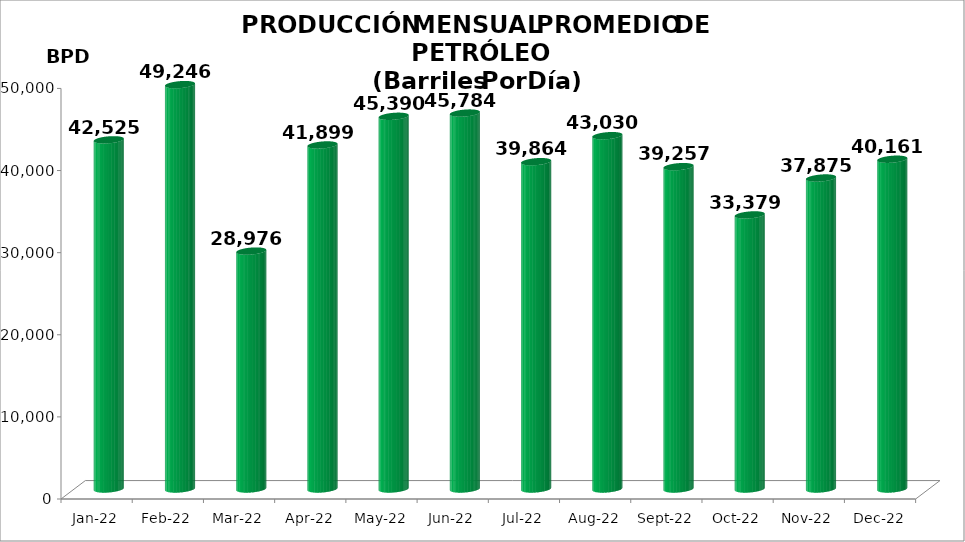
| Category | Series 0 |
|---|---|
| 2022-01-01 | 42524.516 |
| 2022-02-01 | 49246 |
| 2022-03-01 | 28976.419 |
| 2022-04-01 | 41899 |
| 2022-05-01 | 45390.387 |
| 2022-06-01 | 45784.1 |
| 2022-07-01 | 39863.677 |
| 2022-08-01 | 43030.065 |
| 2022-09-01 | 39257.333 |
| 2022-10-01 | 33379.161 |
| 2022-11-01 | 37875.067 |
| 2022-12-01 | 40161.226 |